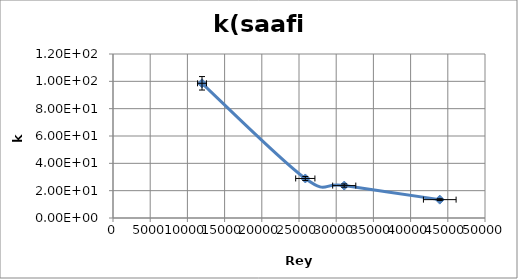
| Category | Series 0 |
|---|---|
| 43920.335251570345 | 13.442 |
| 31078.576328533338 | 23.722 |
| 25846.64333509679 | 28.927 |
| 11963.647764164016 | 98.556 |